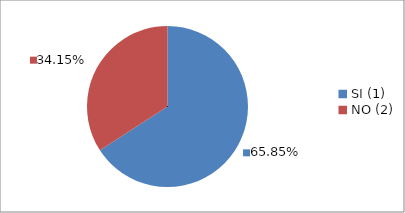
| Category | Series 0 |
|---|---|
| SI (1) | 0.658 |
| NO (2) | 0.342 |